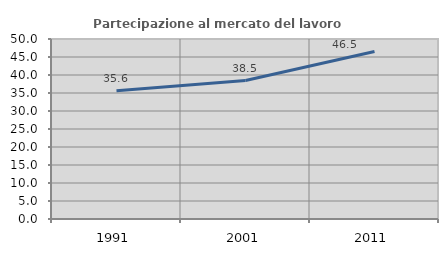
| Category | Partecipazione al mercato del lavoro  femminile |
|---|---|
| 1991.0 | 35.593 |
| 2001.0 | 38.468 |
| 2011.0 | 46.543 |